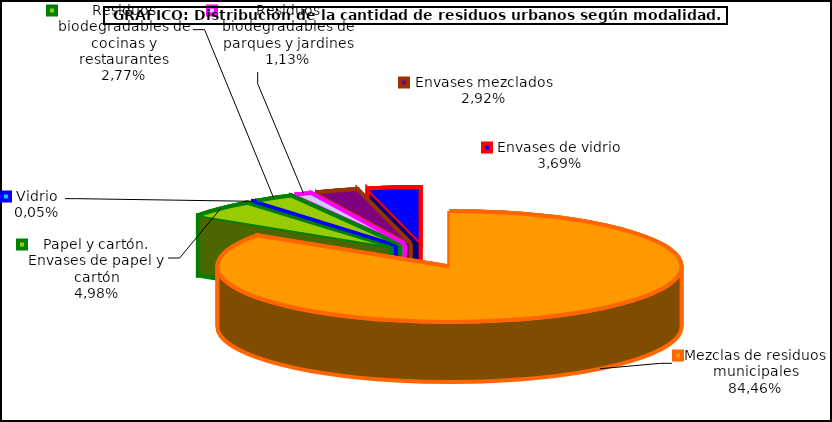
| Category | Total |
|---|---|
| Mezclas de residuos municipales | 0.845 |
| Papel y cartón. Envases de papel y cartón | 0.05 |
| Vidrio | 0 |
| Residuos biodegradables de cocinas y restaurantes | 0.028 |
| Residuos biodegradables de parques y jardines | 0.011 |
| Envases mezclados | 0.029 |
| Envases de vidrio | 0.037 |